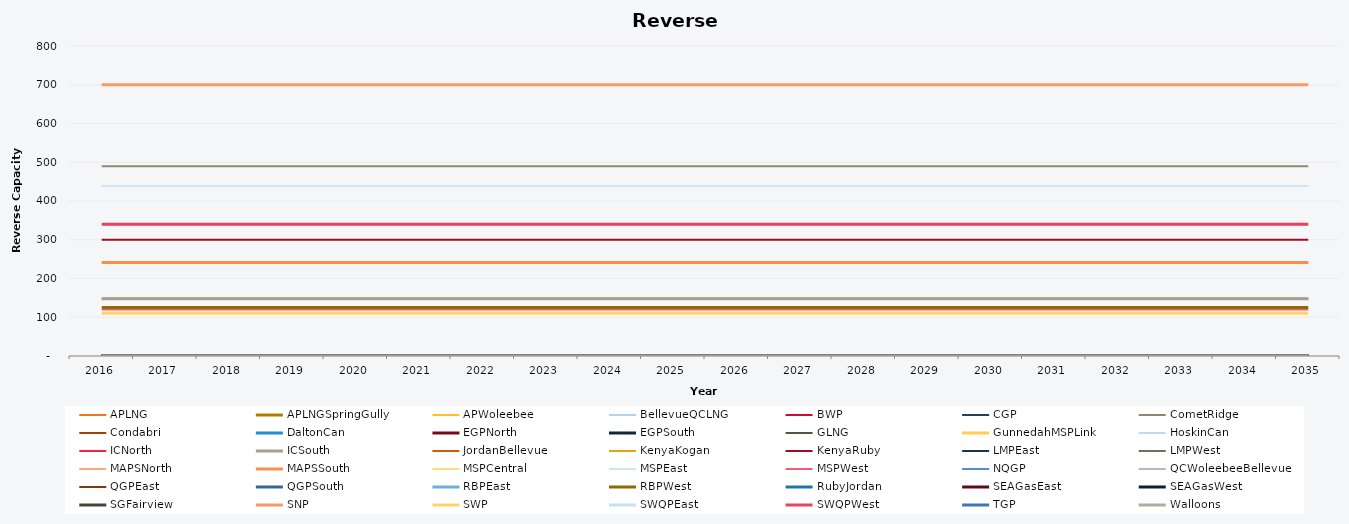
| Category | APLNG | APLNGSpringGully | APWoleebee | BellevueQCLNG | BWP | CGP | CometRidge | Condabri | DaltonCan | EGPNorth | EGPSouth | GLNG | GunnedahMSPLink | HoskinCan | ICNorth | ICSouth | JordanBellevue | KenyaKogan | KenyaRuby | LMPEast | LMPWest | MAPSNorth | MAPSSouth | MSPCentral | MSPEast | MSPWest | NQGP | QCWoleebeeBellevue | QGPEast | QGPSouth | RBPEast | RBPWest | RubyJordan | SEAGasEast | SEAGasWest | SGFairview | SNP | SWP | SWQPEast | SWQPWest | TGP | Walloons |
|---|---|---|---|---|---|---|---|---|---|---|---|---|---|---|---|---|---|---|---|---|---|---|---|---|---|---|---|---|---|---|---|---|---|---|---|---|---|---|---|---|---|---|
| 2016.0 | 0 | 0 | 0 | 0 | 0 | 0 | 490 | 0 | 0 | 0 | 0 | 0 | 0 | 0 | 148 | 148 | 0 | 0 | 300 | 0 | 0 | 241 | 241 | 439 | 439 | 120 | 0 | 0 | 0 | 0 | 0 | 125 | 0 | 0 | 0 | 0 | 700 | 110.5 | 340 | 340 | 0 | 0 |
| 2017.0 | 0 | 0 | 0 | 0 | 0 | 0 | 490 | 0 | 0 | 0 | 0 | 0 | 0 | 0 | 148 | 148 | 0 | 0 | 300 | 0 | 0 | 241 | 241 | 439 | 439 | 120 | 0 | 0 | 0 | 0 | 0 | 125 | 0 | 0 | 0 | 0 | 700 | 110.5 | 340 | 340 | 0 | 0 |
| 2018.0 | 0 | 0 | 0 | 0 | 0 | 0 | 490 | 0 | 0 | 0 | 0 | 0 | 0 | 0 | 148 | 148 | 0 | 0 | 300 | 0 | 0 | 241 | 241 | 439 | 439 | 120 | 0 | 0 | 0 | 0 | 0 | 125 | 0 | 0 | 0 | 0 | 700 | 110.5 | 340 | 340 | 0 | 0 |
| 2019.0 | 0 | 0 | 0 | 0 | 0 | 0 | 490 | 0 | 0 | 0 | 0 | 0 | 0 | 0 | 148 | 148 | 0 | 0 | 300 | 0 | 0 | 241 | 241 | 439 | 439 | 120 | 0 | 0 | 0 | 0 | 0 | 125 | 0 | 0 | 0 | 0 | 700 | 110.5 | 340 | 340 | 0 | 0 |
| 2020.0 | 0 | 0 | 0 | 0 | 0 | 0 | 490 | 0 | 0 | 0 | 0 | 0 | 0 | 0 | 148 | 148 | 0 | 0 | 300 | 0 | 0 | 241 | 241 | 439 | 439 | 120 | 0 | 0 | 0 | 0 | 0 | 125 | 0 | 0 | 0 | 0 | 700 | 110.5 | 340 | 340 | 0 | 0 |
| 2021.0 | 0 | 0 | 0 | 0 | 0 | 0 | 490 | 0 | 0 | 0 | 0 | 0 | 0 | 0 | 148 | 148 | 0 | 0 | 300 | 0 | 0 | 241 | 241 | 439 | 439 | 120 | 0 | 0 | 0 | 0 | 0 | 125 | 0 | 0 | 0 | 0 | 700 | 110.5 | 340 | 340 | 0 | 0 |
| 2022.0 | 0 | 0 | 0 | 0 | 0 | 0 | 490 | 0 | 0 | 0 | 0 | 0 | 0 | 0 | 148 | 148 | 0 | 0 | 300 | 0 | 0 | 241 | 241 | 439 | 439 | 120 | 0 | 0 | 0 | 0 | 0 | 125 | 0 | 0 | 0 | 0 | 700 | 110.5 | 340 | 340 | 0 | 0 |
| 2023.0 | 0 | 0 | 0 | 0 | 0 | 0 | 490 | 0 | 0 | 0 | 0 | 0 | 0 | 0 | 148 | 148 | 0 | 0 | 300 | 0 | 0 | 241 | 241 | 439 | 439 | 120 | 0 | 0 | 0 | 0 | 0 | 125 | 0 | 0 | 0 | 0 | 700 | 110.5 | 340 | 340 | 0 | 0 |
| 2024.0 | 0 | 0 | 0 | 0 | 0 | 0 | 490 | 0 | 0 | 0 | 0 | 0 | 0 | 0 | 148 | 148 | 0 | 0 | 300 | 0 | 0 | 241 | 241 | 439 | 439 | 120 | 0 | 0 | 0 | 0 | 0 | 125 | 0 | 0 | 0 | 0 | 700 | 110.5 | 340 | 340 | 0 | 0 |
| 2025.0 | 0 | 0 | 0 | 0 | 0 | 0 | 490 | 0 | 0 | 0 | 0 | 0 | 0 | 0 | 148 | 148 | 0 | 0 | 300 | 0 | 0 | 241 | 241 | 439 | 439 | 120 | 0 | 0 | 0 | 0 | 0 | 125 | 0 | 0 | 0 | 0 | 700 | 110.5 | 340 | 340 | 0 | 0 |
| 2026.0 | 0 | 0 | 0 | 0 | 0 | 0 | 490 | 0 | 0 | 0 | 0 | 0 | 0 | 0 | 148 | 148 | 0 | 0 | 300 | 0 | 0 | 241 | 241 | 439 | 439 | 120 | 0 | 0 | 0 | 0 | 0 | 125 | 0 | 0 | 0 | 0 | 700 | 110.5 | 340 | 340 | 0 | 0 |
| 2027.0 | 0 | 0 | 0 | 0 | 0 | 0 | 490 | 0 | 0 | 0 | 0 | 0 | 0 | 0 | 148 | 148 | 0 | 0 | 300 | 0 | 0 | 241 | 241 | 439 | 439 | 120 | 0 | 0 | 0 | 0 | 0 | 125 | 0 | 0 | 0 | 0 | 700 | 110.5 | 340 | 340 | 0 | 0 |
| 2028.0 | 0 | 0 | 0 | 0 | 0 | 0 | 490 | 0 | 0 | 0 | 0 | 0 | 0 | 0 | 148 | 148 | 0 | 0 | 300 | 0 | 0 | 241 | 241 | 439 | 439 | 120 | 0 | 0 | 0 | 0 | 0 | 125 | 0 | 0 | 0 | 0 | 700 | 110.5 | 340 | 340 | 0 | 0 |
| 2029.0 | 0 | 0 | 0 | 0 | 0 | 0 | 490 | 0 | 0 | 0 | 0 | 0 | 0 | 0 | 148 | 148 | 0 | 0 | 300 | 0 | 0 | 241 | 241 | 439 | 439 | 120 | 0 | 0 | 0 | 0 | 0 | 125 | 0 | 0 | 0 | 0 | 700 | 110.5 | 340 | 340 | 0 | 0 |
| 2030.0 | 0 | 0 | 0 | 0 | 0 | 0 | 490 | 0 | 0 | 0 | 0 | 0 | 0 | 0 | 148 | 148 | 0 | 0 | 300 | 0 | 0 | 241 | 241 | 439 | 439 | 120 | 0 | 0 | 0 | 0 | 0 | 125 | 0 | 0 | 0 | 0 | 700 | 110.5 | 340 | 340 | 0 | 0 |
| 2031.0 | 0 | 0 | 0 | 0 | 0 | 0 | 490 | 0 | 0 | 0 | 0 | 0 | 0 | 0 | 148 | 148 | 0 | 0 | 300 | 0 | 0 | 241 | 241 | 439 | 439 | 120 | 0 | 0 | 0 | 0 | 0 | 125 | 0 | 0 | 0 | 0 | 700 | 110.5 | 340 | 340 | 0 | 0 |
| 2032.0 | 0 | 0 | 0 | 0 | 0 | 0 | 490 | 0 | 0 | 0 | 0 | 0 | 0 | 0 | 148 | 148 | 0 | 0 | 300 | 0 | 0 | 241 | 241 | 439 | 439 | 120 | 0 | 0 | 0 | 0 | 0 | 125 | 0 | 0 | 0 | 0 | 700 | 110.5 | 340 | 340 | 0 | 0 |
| 2033.0 | 0 | 0 | 0 | 0 | 0 | 0 | 490 | 0 | 0 | 0 | 0 | 0 | 0 | 0 | 148 | 148 | 0 | 0 | 300 | 0 | 0 | 241 | 241 | 439 | 439 | 120 | 0 | 0 | 0 | 0 | 0 | 125 | 0 | 0 | 0 | 0 | 700 | 110.5 | 340 | 340 | 0 | 0 |
| 2034.0 | 0 | 0 | 0 | 0 | 0 | 0 | 490 | 0 | 0 | 0 | 0 | 0 | 0 | 0 | 148 | 148 | 0 | 0 | 300 | 0 | 0 | 241 | 241 | 439 | 439 | 120 | 0 | 0 | 0 | 0 | 0 | 125 | 0 | 0 | 0 | 0 | 700 | 110.5 | 340 | 340 | 0 | 0 |
| 2035.0 | 0 | 0 | 0 | 0 | 0 | 0 | 490 | 0 | 0 | 0 | 0 | 0 | 0 | 0 | 148 | 148 | 0 | 0 | 300 | 0 | 0 | 241 | 241 | 439 | 439 | 120 | 0 | 0 | 0 | 0 | 0 | 125 | 0 | 0 | 0 | 0 | 700 | 110.5 | 340 | 340 | 0 | 0 |